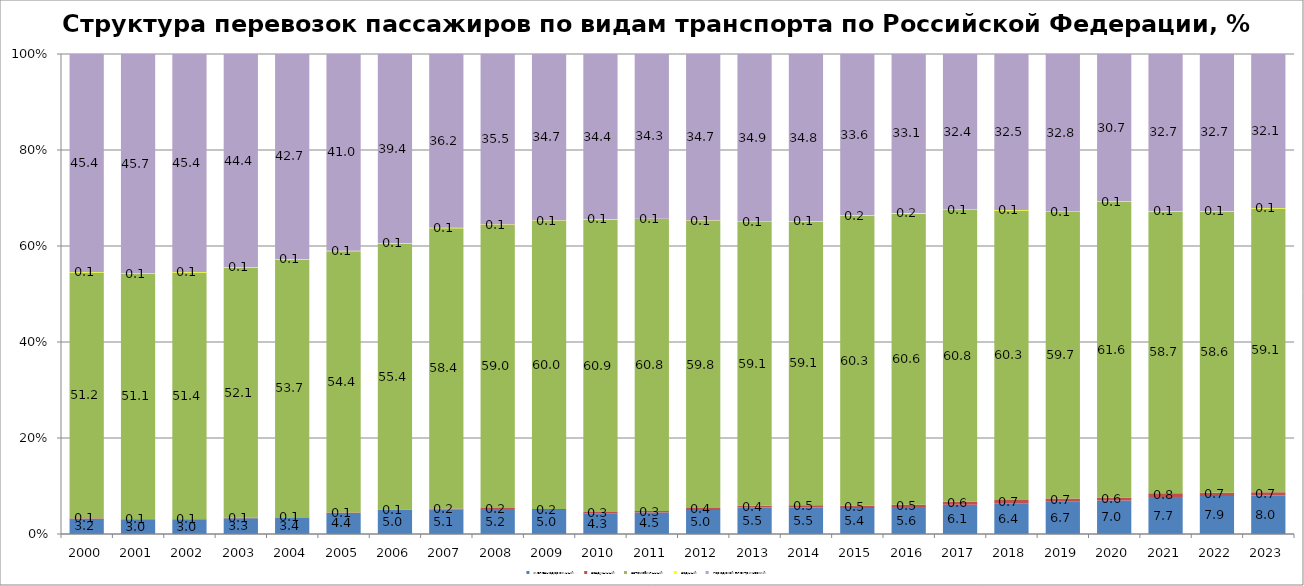
| Category | железнодорожный | воздушный | автомобильный | водный | городской электрический |
|---|---|---|---|---|---|
| 2000.0 | 3.2 | 0.1 | 51.2 | 0.1 | 45.4 |
| 2001.0 | 3 | 0.1 | 51.1 | 0.1 | 45.7 |
| 2002.0 | 3 | 0.1 | 51.4 | 0.1 | 45.4 |
| 2003.0 | 3.3 | 0.1 | 52.1 | 0.1 | 44.4 |
| 2004.0 | 3.4 | 0.1 | 53.7 | 0.1 | 42.7 |
| 2005.0 | 4.4 | 0.1 | 54.4 | 0.1 | 41 |
| 2006.0 | 5 | 0.1 | 55.4 | 0.1 | 39.4 |
| 2007.0 | 5.1 | 0.2 | 58.4 | 0.1 | 36.2 |
| 2008.0 | 5.2 | 0.2 | 59 | 0.1 | 35.5 |
| 2009.0 | 5 | 0.2 | 60 | 0.1 | 34.7 |
| 2010.0 | 4.3 | 0.3 | 60.9 | 0.1 | 34.4 |
| 2011.0 | 4.5 | 0.3 | 60.8 | 0.1 | 34.3 |
| 2012.0 | 5 | 0.4 | 59.8 | 0.1 | 34.7 |
| 2013.0 | 5.5 | 0.4 | 59.1 | 0.1 | 34.9 |
| 2014.0 | 5.5 | 0.5 | 59.1 | 0.1 | 34.8 |
| 2015.0 | 5.4 | 0.5 | 60.3 | 0.15 | 33.6 |
| 2016.0 | 5.6 | 0.5 | 60.6 | 0.17 | 33.1 |
| 2017.0 | 6.1 | 0.6 | 60.8 | 0.1 | 32.4 |
| 2018.0 | 6.4 | 0.7 | 60.3 | 0.1 | 32.5 |
| 2019.0 | 6.7 | 0.7 | 59.7 | 0.1 | 32.8 |
| 2020.0 | 7 | 0.6 | 61.6 | 0.1 | 30.7 |
| 2021.0 | 7.7 | 0.8 | 58.7 | 0.1 | 32.7 |
| 2022.0 | 7.9 | 0.7 | 58.6 | 0.1 | 32.7 |
| 2023.0 | 8 | 0.7 | 59.1 | 0.1 | 32.1 |